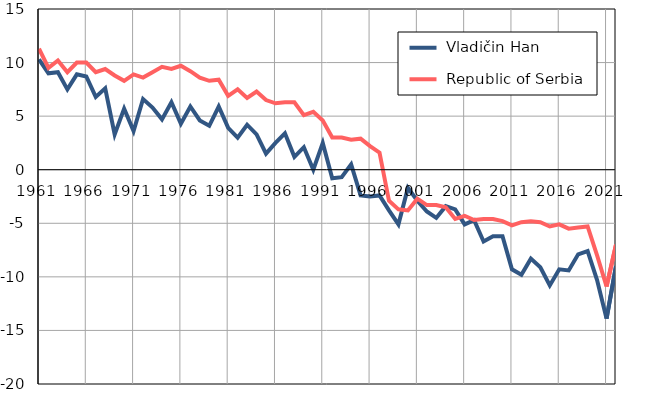
| Category |  Vladičin Han |  Republic of Serbia |
|---|---|---|
| 1961.0 | 10.3 | 11.3 |
| 1962.0 | 9 | 9.5 |
| 1963.0 | 9.1 | 10.2 |
| 1964.0 | 7.5 | 9.1 |
| 1965.0 | 8.9 | 10 |
| 1966.0 | 8.7 | 10 |
| 1967.0 | 6.8 | 9.1 |
| 1968.0 | 7.6 | 9.4 |
| 1969.0 | 3.3 | 8.8 |
| 1970.0 | 5.7 | 8.3 |
| 1971.0 | 3.6 | 8.9 |
| 1972.0 | 6.6 | 8.6 |
| 1973.0 | 5.8 | 9.1 |
| 1974.0 | 4.7 | 9.6 |
| 1975.0 | 6.3 | 9.4 |
| 1976.0 | 4.3 | 9.7 |
| 1977.0 | 5.9 | 9.2 |
| 1978.0 | 4.6 | 8.6 |
| 1979.0 | 4.1 | 8.3 |
| 1980.0 | 5.9 | 8.4 |
| 1981.0 | 3.9 | 6.9 |
| 1982.0 | 3 | 7.5 |
| 1983.0 | 4.2 | 6.7 |
| 1984.0 | 3.3 | 7.3 |
| 1985.0 | 1.5 | 6.5 |
| 1986.0 | 2.5 | 6.2 |
| 1987.0 | 3.4 | 6.3 |
| 1988.0 | 1.2 | 6.3 |
| 1989.0 | 2.1 | 5.1 |
| 1990.0 | 0 | 5.4 |
| 1991.0 | 2.5 | 4.6 |
| 1992.0 | -0.8 | 3 |
| 1993.0 | -0.7 | 3 |
| 1994.0 | 0.5 | 2.8 |
| 1995.0 | -2.4 | 2.9 |
| 1996.0 | -2.5 | 2.2 |
| 1997.0 | -2.4 | 1.6 |
| 1998.0 | -3.8 | -2.9 |
| 1999.0 | -5.1 | -3.7 |
| 2000.0 | -1.7 | -3.8 |
| 2001.0 | -2.9 | -2.7 |
| 2002.0 | -3.9 | -3.3 |
| 2003.0 | -4.5 | -3.3 |
| 2004.0 | -3.4 | -3.5 |
| 2005.0 | -3.7 | -4.6 |
| 2006.0 | -5.1 | -4.3 |
| 2007.0 | -4.7 | -4.7 |
| 2008.0 | -6.7 | -4.6 |
| 2009.0 | -6.2 | -4.6 |
| 2010.0 | -6.2 | -4.8 |
| 2011.0 | -9.3 | -5.2 |
| 2012.0 | -9.8 | -4.9 |
| 2013.0 | -8.3 | -4.8 |
| 2014.0 | -9.1 | -4.9 |
| 2015.0 | -10.8 | -5.3 |
| 2016.0 | -9.3 | -5.1 |
| 2017.0 | -9.4 | -5.5 |
| 2018.0 | -7.9 | -5.4 |
| 2019.0 | -7.6 | -5.3 |
| 2020.0 | -10.3 | -8 |
| 2021.0 | -13.9 | -10.9 |
| 2022.0 | -9 | -7 |